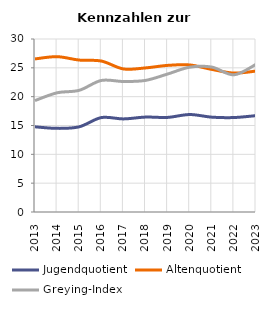
| Category | Jugendquotient | Altenquotient | Greying-Index |
|---|---|---|---|
| 2013.0 | 14.771 | 26.545 | 19.324 |
| 2014.0 | 14.502 | 26.936 | 20.672 |
| 2015.0 | 14.773 | 26.346 | 21.102 |
| 2016.0 | 16.371 | 26.182 | 22.809 |
| 2017.0 | 16.143 | 24.809 | 22.628 |
| 2018.0 | 16.459 | 24.986 | 22.822 |
| 2019.0 | 16.403 | 25.424 | 23.924 |
| 2020.0 | 16.9 | 25.5 | 25.11 |
| 2021.0 | 16.446 | 24.725 | 25.131 |
| 2022.0 | 16.38 | 24.09 | 23.79 |
| 2023.0 | 16.707 | 24.439 | 25.606 |